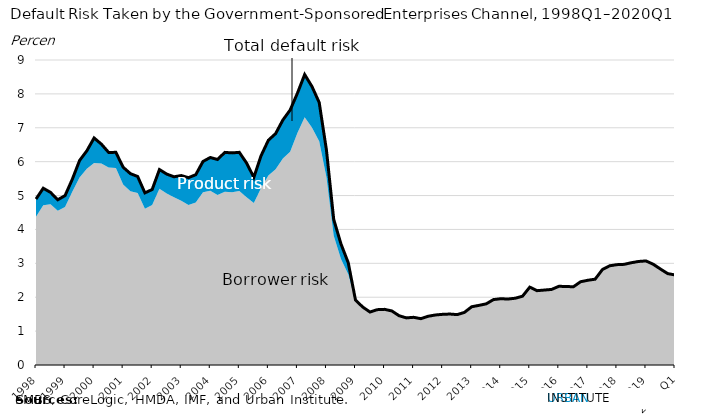
| Category | Series 2 |
|---|---|
| 1998 | 4.897 |
| 1998 | 5.216 |
| 1998 | 5.094 |
| 1998 | 4.876 |
| 1999 | 4.999 |
| 1999 | 5.48 |
| 1999 | 6.034 |
| 1999 | 6.32 |
| 2000 | 6.7 |
| 2000 | 6.518 |
| 2000 | 6.274 |
| 2000 | 6.274 |
| 2001 | 5.836 |
| 2001 | 5.647 |
| 2001 | 5.562 |
| 2001 | 5.079 |
| 2002 | 5.179 |
| 2002 | 5.767 |
| 2002 | 5.634 |
| 2002 | 5.554 |
| 2003 | 5.59 |
| 2003 | 5.528 |
| 2003 | 5.615 |
| 2003 | 6.006 |
| 2004 | 6.123 |
| 2004 | 6.064 |
| 2004 | 6.274 |
| 2004 | 6.259 |
| 2005 | 6.275 |
| 2005 | 5.959 |
| 2005 | 5.538 |
| 2005 | 6.177 |
| 2006 | 6.632 |
| 2006 | 6.828 |
| 2006 | 7.23 |
| 2006 | 7.524 |
| 2007 | 8.019 |
| 2007 | 8.571 |
| 2007 | 8.22 |
| 2007 | 7.747 |
| 2008 | 6.342 |
| 2008 | 4.296 |
| 2008 | 3.571 |
| 2008 | 3.018 |
| 2009 | 1.915 |
| 2009 | 1.71 |
| 2009 | 1.562 |
| 2009 | 1.633 |
| 2010 | 1.642 |
| 2010 | 1.596 |
| 2010 | 1.455 |
| 2010 | 1.39 |
| 2011 | 1.407 |
| 2011 | 1.367 |
| 2011 | 1.438 |
| 2011 | 1.476 |
| 2012 | 1.495 |
| 2012 | 1.504 |
| 2012 | 1.487 |
| 2012 | 1.552 |
| 2013 | 1.719 |
| 2013 | 1.76 |
| 2013 | 1.804 |
| 2013 | 1.93 |
| 2014 | 1.956 |
| 2014 | 1.947 |
| 2014 | 1.97 |
| 2014 | 2.03 |
| 2015 | 2.298 |
| 2015 | 2.193 |
| 2015 | 2.211 |
| 2015 | 2.23 |
| 2016 | 2.321 |
| 2016 | 2.318 |
| 2016 | 2.307 |
| 2016 | 2.457 |
| 2017 | 2.501 |
| 2017 | 2.532 |
| 2017 | 2.816 |
| 2017 | 2.927 |
| 2018 | 2.961 |
| 2018 | 2.97 |
| 2018 | 3.019 |
| 2018 | 3.055 |
| 2019 | 3.071 |
| 2019 | 2.974 |
| 2019 | 2.831 |
| 2019 | 2.696 |
| 2020 Q1 | 2.658 |